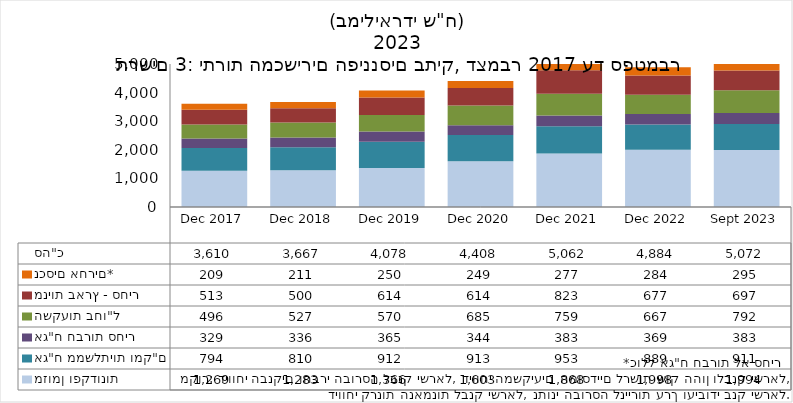
| Category | מזומן ופקדונות | אג"ח ממשלתיות ומק"ם | אג"ח חברות סחיר | השקעות בחו"ל | מניות בארץ - סחיר | נכסים אחרים* | סה"כ |
|---|---|---|---|---|---|---|---|
| 2017-12-31 | 1268.97 | 793.97 | 329.2 | 496.34 | 512.85 | 209.04 | 3610.37 |
| 2018-12-31 | 1283.26 | 809.81 | 335.75 | 527.47 | 499.59 | 211.19 | 3667.07 |
| 2019-12-31 | 1365.73 | 911.91 | 365.33 | 570.44 | 614.38 | 249.97 | 4077.76 |
| 2020-12-31 | 1603.4 | 912.54 | 344.34 | 685.28 | 613.6 | 248.61 | 4407.77 |
| 2021-12-31 | 1867.92 | 952.58 | 383.05 | 759.49 | 822.75 | 276.62 | 5062.41 |
| 2022-12-31 | 1998.01 | 888.74 | 368.98 | 666.83 | 677.21 | 284.29 | 4884.06 |
| 2023-09-30 | 1994.15 | 910.55 | 383.11 | 791.93 | 696.84 | 295.12 | 5071.7 |